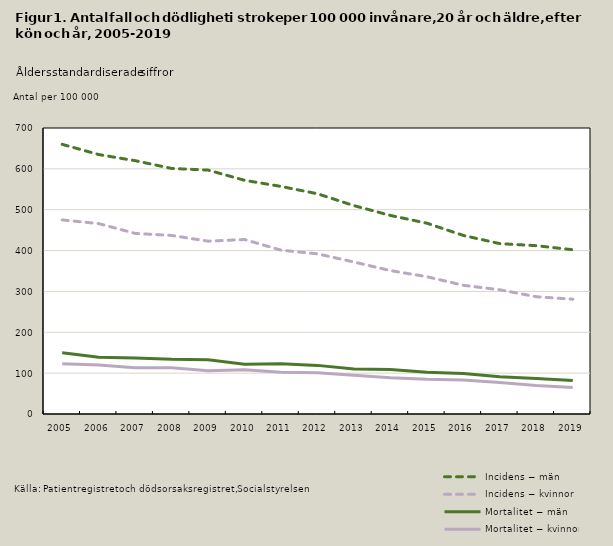
| Category | Incidens − män | Incidens − kvinnor | Mortalitet − män | Mortalitet − kvinnor |
|---|---|---|---|---|
| 2005.0 | 660 | 475 | 150 | 123 |
| 2006.0 | 635 | 466 | 139 | 120 |
| 2007.0 | 620 | 442 | 137 | 113 |
| 2008.0 | 601 | 437 | 134 | 113 |
| 2009.0 | 597 | 423 | 133 | 106 |
| 2010.0 | 572 | 427 | 122 | 108 |
| 2011.0 | 557 | 401 | 123 | 102 |
| 2012.0 | 539 | 392 | 119 | 101 |
| 2013.0 | 510 | 372 | 110 | 95 |
| 2014.0 | 486 | 351 | 109 | 89 |
| 2015.0 | 467 | 336 | 102 | 85 |
| 2016.0 | 437 | 315 | 99 | 83 |
| 2017.0 | 417 | 304 | 91 | 77 |
| 2018.0 | 412 | 287 | 87 | 70 |
| 2019.0 | 402 | 281 | 82 | 65 |